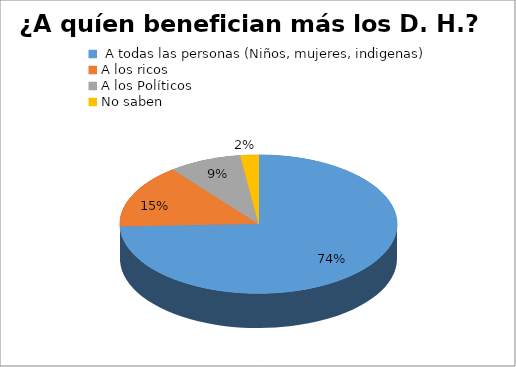
| Category | Series 0 |
|---|---|
|  A todas las personas (Niños, mujeres, indigenas) | 70 |
| A los ricos | 14 |
| A los Políticos | 8 |
| No saben | 2 |